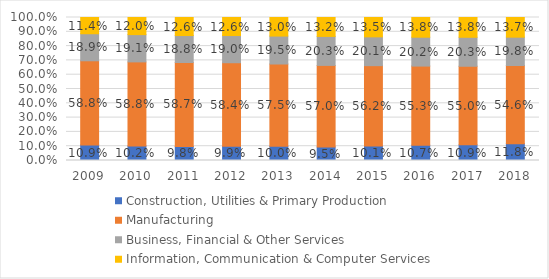
| Category | Construction, Utilities & Primary Production  | Manufacturing  | Business, Financial & Other Services | Information, Communication & Computer Services |
|---|---|---|---|---|
| 2009.0 | 0.109 | 0.588 | 0.189 | 0.114 |
| 2010.0 | 0.102 | 0.588 | 0.191 | 0.12 |
| 2011.0 | 0.098 | 0.587 | 0.188 | 0.126 |
| 2012.0 | 0.099 | 0.584 | 0.19 | 0.126 |
| 2013.0 | 0.1 | 0.575 | 0.195 | 0.13 |
| 2014.0 | 0.095 | 0.57 | 0.203 | 0.132 |
| 2015.0 | 0.101 | 0.562 | 0.201 | 0.135 |
| 2016.0 | 0.107 | 0.553 | 0.202 | 0.138 |
| 2017.0 | 0.109 | 0.55 | 0.203 | 0.138 |
| 2018.0 | 0.118 | 0.546 | 0.198 | 0.137 |